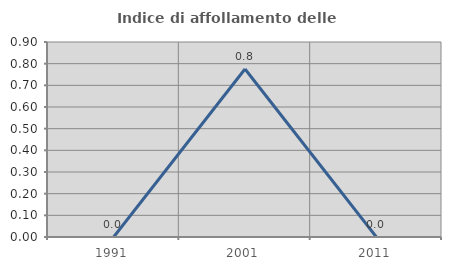
| Category | Indice di affollamento delle abitazioni  |
|---|---|
| 1991.0 | 0 |
| 2001.0 | 0.775 |
| 2011.0 | 0 |